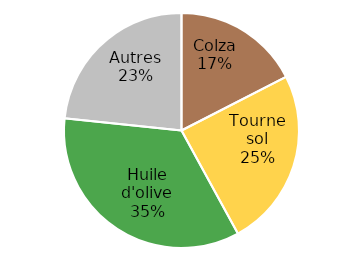
| Category | Series 0 |
|---|---|
| Colza | 4847.152 |
| Tournesol | 6831.901 |
| Huile d'olive | 9621.549 |
| Autres | 6483.97 |